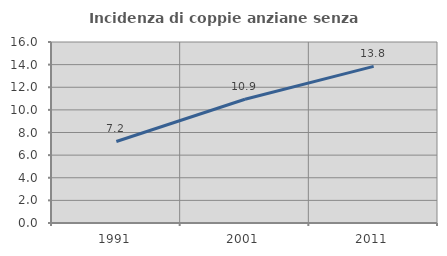
| Category | Incidenza di coppie anziane senza figli  |
|---|---|
| 1991.0 | 7.207 |
| 2001.0 | 10.938 |
| 2011.0 | 13.846 |